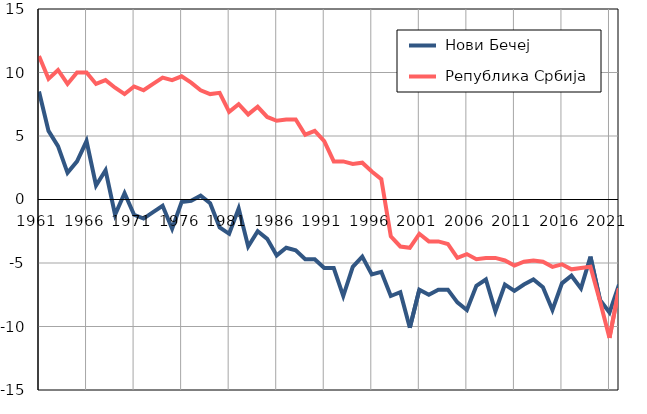
| Category |  Нови Бечеј |  Република Србија |
|---|---|---|
| 1961.0 | 8.5 | 11.3 |
| 1962.0 | 5.4 | 9.5 |
| 1963.0 | 4.2 | 10.2 |
| 1964.0 | 2.1 | 9.1 |
| 1965.0 | 3 | 10 |
| 1966.0 | 4.6 | 10 |
| 1967.0 | 1.1 | 9.1 |
| 1968.0 | 2.3 | 9.4 |
| 1969.0 | -1.2 | 8.8 |
| 1970.0 | 0.5 | 8.3 |
| 1971.0 | -1.2 | 8.9 |
| 1972.0 | -1.5 | 8.6 |
| 1973.0 | -1 | 9.1 |
| 1974.0 | -0.5 | 9.6 |
| 1975.0 | -2.3 | 9.4 |
| 1976.0 | -0.2 | 9.7 |
| 1977.0 | -0.1 | 9.2 |
| 1978.0 | 0.3 | 8.6 |
| 1979.0 | -0.3 | 8.3 |
| 1980.0 | -2.2 | 8.4 |
| 1981.0 | -2.7 | 6.9 |
| 1982.0 | -0.7 | 7.5 |
| 1983.0 | -3.7 | 6.7 |
| 1984.0 | -2.5 | 7.3 |
| 1985.0 | -3.1 | 6.5 |
| 1986.0 | -4.4 | 6.2 |
| 1987.0 | -3.8 | 6.3 |
| 1988.0 | -4 | 6.3 |
| 1989.0 | -4.7 | 5.1 |
| 1990.0 | -4.7 | 5.4 |
| 1991.0 | -5.4 | 4.6 |
| 1992.0 | -5.4 | 3 |
| 1993.0 | -7.6 | 3 |
| 1994.0 | -5.3 | 2.8 |
| 1995.0 | -4.5 | 2.9 |
| 1996.0 | -5.9 | 2.2 |
| 1997.0 | -5.7 | 1.6 |
| 1998.0 | -7.6 | -2.9 |
| 1999.0 | -7.3 | -3.7 |
| 2000.0 | -10.1 | -3.8 |
| 2001.0 | -7.1 | -2.7 |
| 2002.0 | -7.5 | -3.3 |
| 2003.0 | -7.1 | -3.3 |
| 2004.0 | -7.1 | -3.5 |
| 2005.0 | -8.1 | -4.6 |
| 2006.0 | -8.7 | -4.3 |
| 2007.0 | -6.8 | -4.7 |
| 2008.0 | -6.3 | -4.6 |
| 2009.0 | -8.8 | -4.6 |
| 2010.0 | -6.7 | -4.8 |
| 2011.0 | -7.2 | -5.2 |
| 2012.0 | -6.7 | -4.9 |
| 2013.0 | -6.3 | -4.8 |
| 2014.0 | -6.9 | -4.9 |
| 2015.0 | -8.7 | -5.3 |
| 2016.0 | -6.6 | -5.1 |
| 2017.0 | -6 | -5.5 |
| 2018.0 | -7 | -5.4 |
| 2019.0 | -4.5 | -5.3 |
| 2020.0 | -7.9 | -8 |
| 2021.0 | -8.9 | -10.9 |
| 2022.0 | -6.7 | -7 |